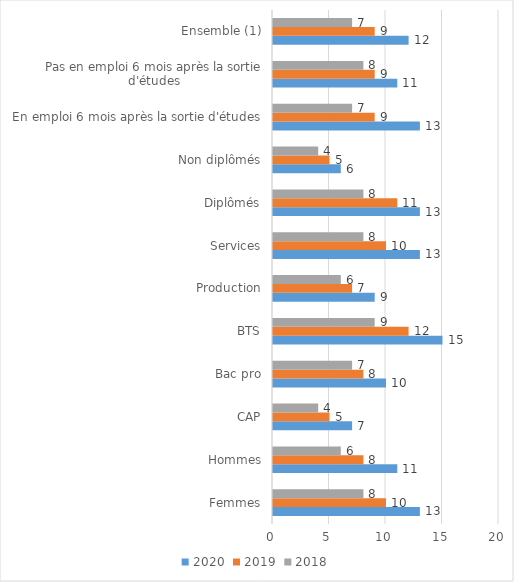
| Category | 2020 | 2019 | 2018 |
|---|---|---|---|
| Femmes | 13 | 10 | 8 |
| Hommes | 11 | 8 | 6 |
| CAP | 7 | 5 | 4 |
| Bac pro | 10 | 8 | 7 |
| BTS | 15 | 12 | 9 |
| Production | 9 | 7 | 6 |
| Services | 13 | 10 | 8 |
| Diplômés | 13 | 11 | 8 |
| Non diplômés | 6 | 5 | 4 |
| En emploi 6 mois après la sortie d'études | 13 | 9 | 7 |
| Pas en emploi 6 mois après la sortie d'études | 11 | 9 | 8 |
| Ensemble (1) | 12 | 9 | 7 |